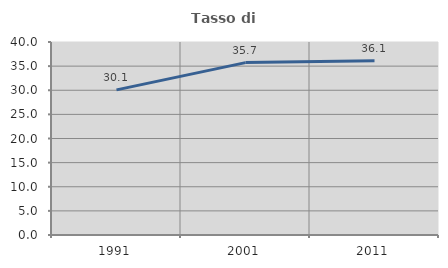
| Category | Tasso di occupazione   |
|---|---|
| 1991.0 | 30.082 |
| 2001.0 | 35.731 |
| 2011.0 | 36.099 |